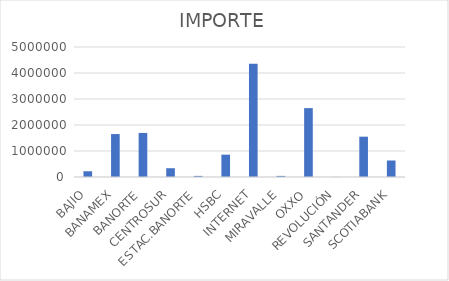
| Category | IMPORTE |
|---|---|
| BAJIO | 221257.87 |
| BANAMEX | 1651162.6 |
| BANORTE | 1694401.07 |
| CENTROSUR | 337175 |
| ESTAC.BANORTE | 42252.05 |
| HSBC | 858445.27 |
| INTERNET | 4357873.09 |
| MIRAVALLE | 42314 |
| OXXO | 2649338.56 |
| REVOLUCIÓN | 3287 |
| SANTANDER | 1550663.91 |
| SCOTIABANK | 634623.89 |